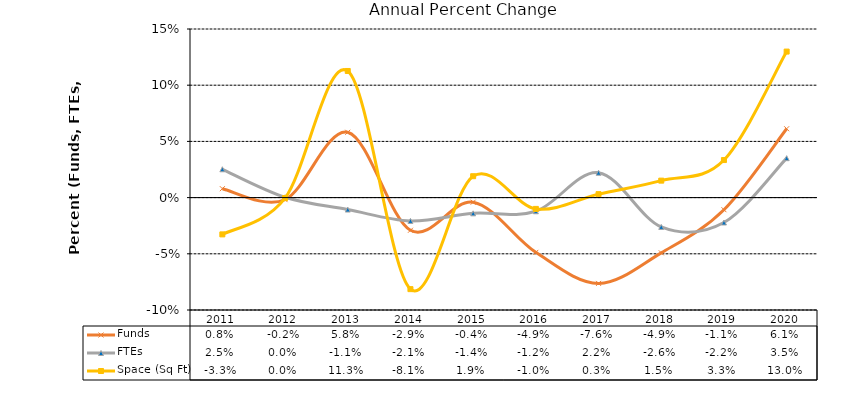
| Category | Funds | FTEs | Space (Sq Ft) |
|---|---|---|---|
| 2011.0 | 0.008 | 0.025 | -0.033 |
| 2012.0 | -0.002 | 0 | 0 |
| 2013.0 | 0.058 | -0.011 | 0.113 |
| 2014.0 | -0.029 | -0.021 | -0.081 |
| 2015.0 | -0.004 | -0.014 | 0.019 |
| 2016.0 | -0.049 | -0.012 | -0.01 |
| 2017.0 | -0.076 | 0.022 | 0.003 |
| 2018.0 | -0.049 | -0.026 | 0.015 |
| 2019.0 | -0.011 | -0.022 | 0.033 |
| 2020.0 | 0.061 | 0.035 | 0.13 |